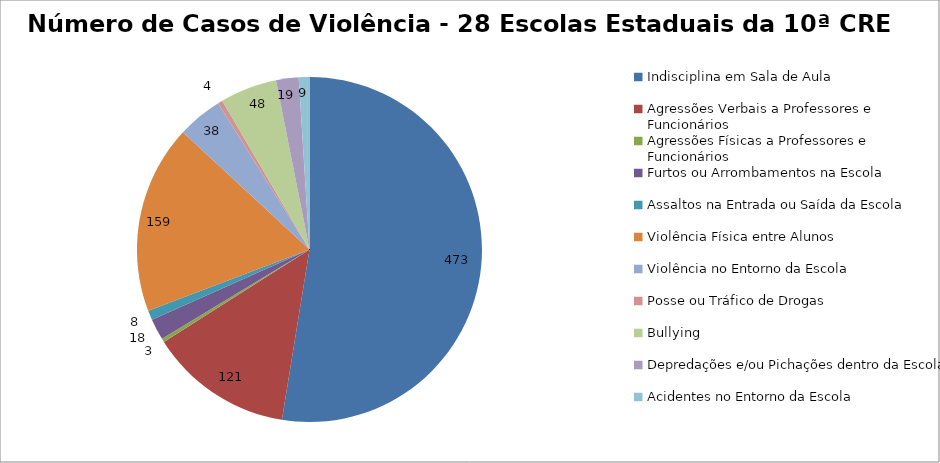
| Category | Número de Casos |
|---|---|
| Indisciplina em Sala de Aula | 473 |
| Agressões Verbais a Professores e Funcionários | 121 |
| Agressões Físicas a Professores e Funcionários | 3 |
| Furtos ou Arrombamentos na Escola | 18 |
| Assaltos na Entrada ou Saída da Escola | 8 |
| Violência Física entre Alunos | 159 |
| Violência no Entorno da Escola | 38 |
| Posse ou Tráfico de Drogas | 4 |
| Bullying | 48 |
| Depredações e/ou Pichações dentro da Escola | 19 |
| Acidentes no Entorno da Escola | 9 |